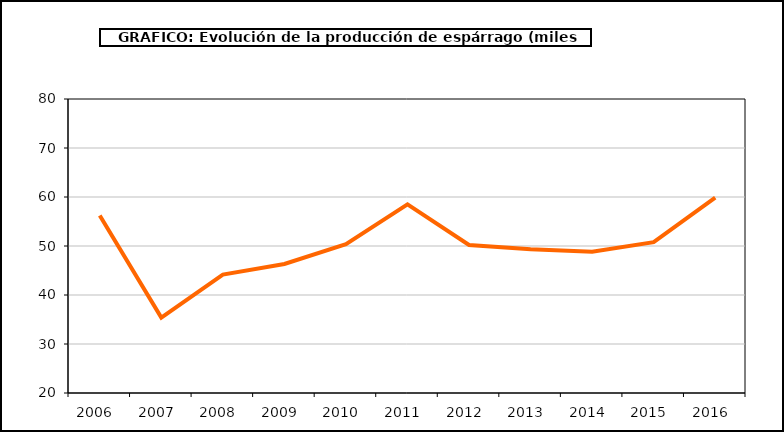
| Category | producción |
|---|---|
| 2006.0 | 56.21 |
| 2007.0 | 35.396 |
| 2008.0 | 44.169 |
| 2009.0 | 46.324 |
| 2010.0 | 50.362 |
| 2011.0 | 58.496 |
| 2012.0 | 50.212 |
| 2013.0 | 49.352 |
| 2014.0 | 48.814 |
| 2015.0 | 50.771 |
| 2016.0 | 59.869 |